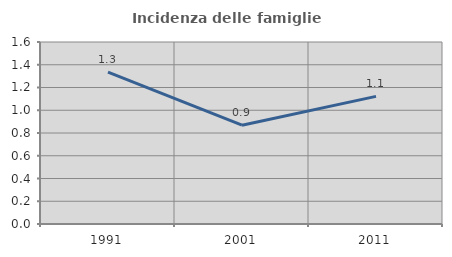
| Category | Incidenza delle famiglie numerose |
|---|---|
| 1991.0 | 1.335 |
| 2001.0 | 0.869 |
| 2011.0 | 1.122 |